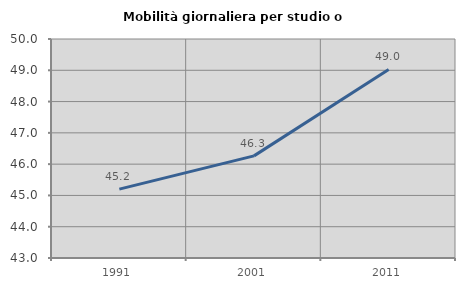
| Category | Mobilità giornaliera per studio o lavoro |
|---|---|
| 1991.0 | 45.201 |
| 2001.0 | 46.264 |
| 2011.0 | 49.026 |